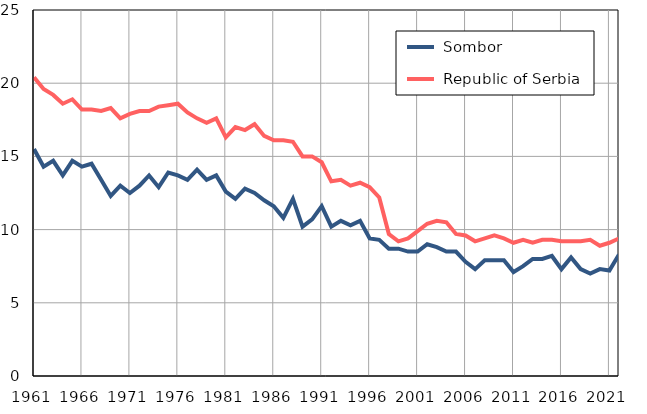
| Category |  Sombor |  Republic of Serbia |
|---|---|---|
| 1961.0 | 15.5 | 20.4 |
| 1962.0 | 14.3 | 19.6 |
| 1963.0 | 14.7 | 19.2 |
| 1964.0 | 13.7 | 18.6 |
| 1965.0 | 14.7 | 18.9 |
| 1966.0 | 14.3 | 18.2 |
| 1967.0 | 14.5 | 18.2 |
| 1968.0 | 13.4 | 18.1 |
| 1969.0 | 12.3 | 18.3 |
| 1970.0 | 13 | 17.6 |
| 1971.0 | 12.5 | 17.9 |
| 1972.0 | 13 | 18.1 |
| 1973.0 | 13.7 | 18.1 |
| 1974.0 | 12.9 | 18.4 |
| 1975.0 | 13.9 | 18.5 |
| 1976.0 | 13.7 | 18.6 |
| 1977.0 | 13.4 | 18 |
| 1978.0 | 14.1 | 17.6 |
| 1979.0 | 13.4 | 17.3 |
| 1980.0 | 13.7 | 17.6 |
| 1981.0 | 12.6 | 16.3 |
| 1982.0 | 12.1 | 17 |
| 1983.0 | 12.8 | 16.8 |
| 1984.0 | 12.5 | 17.2 |
| 1985.0 | 12 | 16.4 |
| 1986.0 | 11.6 | 16.1 |
| 1987.0 | 10.8 | 16.1 |
| 1988.0 | 12.1 | 16 |
| 1989.0 | 10.2 | 15 |
| 1990.0 | 10.7 | 15 |
| 1991.0 | 11.6 | 14.6 |
| 1992.0 | 10.2 | 13.3 |
| 1993.0 | 10.6 | 13.4 |
| 1994.0 | 10.3 | 13 |
| 1995.0 | 10.6 | 13.2 |
| 1996.0 | 9.4 | 12.9 |
| 1997.0 | 9.3 | 12.2 |
| 1998.0 | 8.7 | 9.7 |
| 1999.0 | 8.7 | 9.2 |
| 2000.0 | 8.5 | 9.4 |
| 2001.0 | 8.5 | 9.9 |
| 2002.0 | 9 | 10.4 |
| 2003.0 | 8.8 | 10.6 |
| 2004.0 | 8.5 | 10.5 |
| 2005.0 | 8.5 | 9.7 |
| 2006.0 | 7.8 | 9.6 |
| 2007.0 | 7.3 | 9.2 |
| 2008.0 | 7.9 | 9.4 |
| 2009.0 | 7.9 | 9.6 |
| 2010.0 | 7.9 | 9.4 |
| 2011.0 | 7.1 | 9.1 |
| 2012.0 | 7.5 | 9.3 |
| 2013.0 | 8 | 9.1 |
| 2014.0 | 8 | 9.3 |
| 2015.0 | 8.2 | 9.3 |
| 2016.0 | 7.3 | 9.2 |
| 2017.0 | 8.1 | 9.2 |
| 2018.0 | 7.3 | 9.2 |
| 2019.0 | 7 | 9.3 |
| 2020.0 | 7.3 | 8.9 |
| 2021.0 | 7.2 | 9.1 |
| 2022.0 | 8.3 | 9.4 |